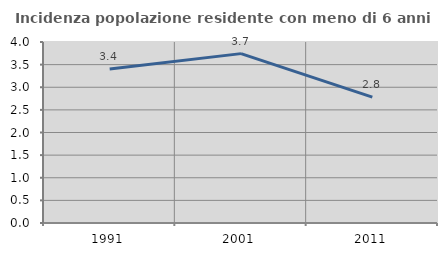
| Category | Incidenza popolazione residente con meno di 6 anni |
|---|---|
| 1991.0 | 3.401 |
| 2001.0 | 3.743 |
| 2011.0 | 2.783 |